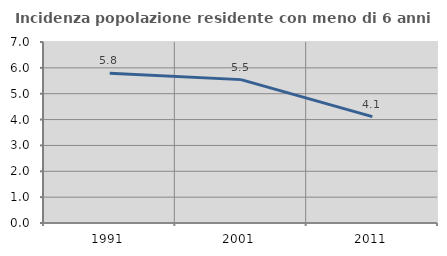
| Category | Incidenza popolazione residente con meno di 6 anni |
|---|---|
| 1991.0 | 5.789 |
| 2001.0 | 5.545 |
| 2011.0 | 4.113 |